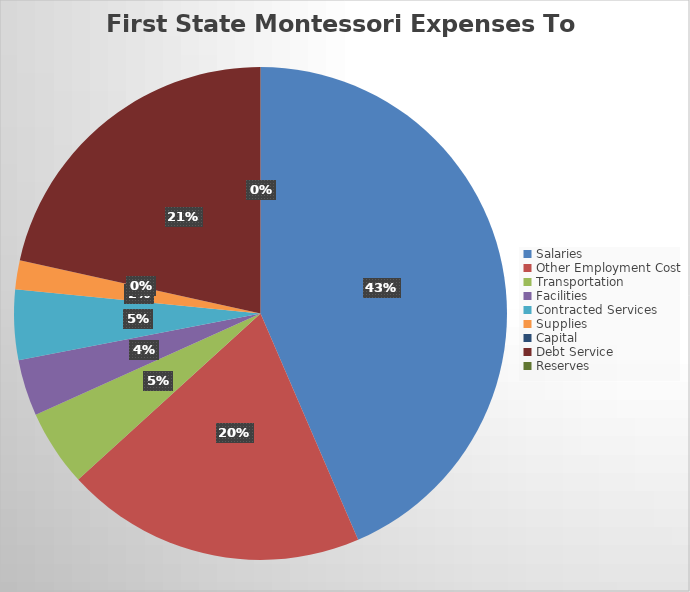
| Category | Series 0 |
|---|---|
| Salaries | 1553260.77 |
| Other Employment Cost | 703950.09 |
| Transportation | 179483.29 |
| Facilities | 131693.81 |
| Contracted Services | 164674.93 |
| Supplies | 67232.86 |
| Capital | 0 |
| Debt Service | 768822.52 |
| Reserves | 0 |